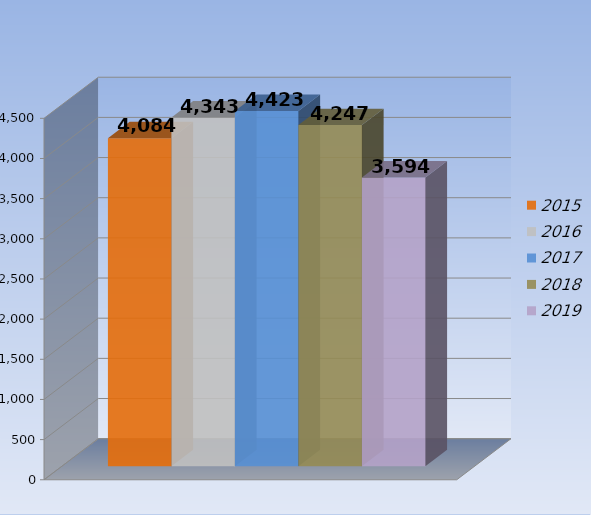
| Category | 2015 | 2016 | 2017 | 2018 | 2019 |
|---|---|---|---|---|---|
| 0 | 4084 | 4343 | 4423 | 4247 | 3594 |